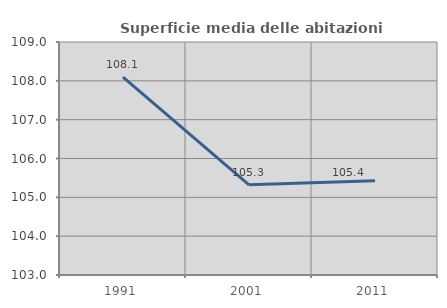
| Category | Superficie media delle abitazioni occupate |
|---|---|
| 1991.0 | 108.097 |
| 2001.0 | 105.322 |
| 2011.0 | 105.426 |